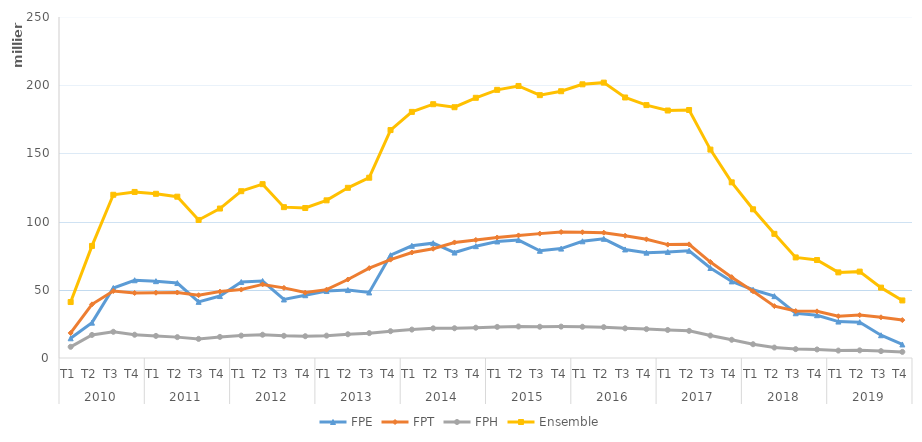
| Category | FPE | FPT | FPH | Ensemble |
|---|---|---|---|---|
| 0 | 14461 | 18375 | 8194 | 41030 |
| 1 | 25920 | 39331 | 16913 | 82164 |
| 2 | 51330 | 49127 | 19215 | 119672 |
| 3 | 56997 | 47685 | 17058 | 121740 |
| 4 | 56333 | 47855 | 16199 | 120387 |
| 5 | 54941 | 48017 | 15304 | 118262 |
| 6 | 41169 | 46030 | 14012 | 101211 |
| 7 | 45419 | 48677 | 15477 | 109573 |
| 8 | 55694 | 50172 | 16422 | 122288 |
| 9 | 56439 | 53952 | 17062 | 127453 |
| 10 | 42911 | 51408 | 16274 | 110593 |
| 11 | 46016 | 47957 | 15977 | 109950 |
| 12 | 49098 | 50100 | 16390 | 115588 |
| 13 | 49798 | 57543 | 17423 | 124764 |
| 14 | 48046 | 65901 | 18228 | 132175 |
| 15 | 75352 | 72092 | 19655 | 167099 |
| 16 | 82269 | 77335 | 20830 | 180434 |
| 17 | 84197 | 80120 | 21744 | 186061 |
| 18 | 77322 | 84712 | 21821 | 183855 |
| 19 | 81992 | 86552 | 22218 | 190762 |
| 20 | 85438 | 88354 | 22793 | 196585 |
| 21 | 86468 | 89868 | 23104 | 199440 |
| 22 | 78611 | 91183 | 22915 | 192709 |
| 23 | 80203 | 92369 | 23008 | 195580 |
| 24 | 85564 | 92183 | 22899 | 200646 |
| 25 | 87386 | 91885 | 22610 | 201881 |
| 26 | 79587 | 89645 | 21763 | 190995 |
| 27 | 77240 | 86998 | 21175 | 185413 |
| 28 | 77764 | 83129 | 20553 | 181446 |
| 29 | 78598 | 83323 | 19893 | 181814 |
| 30 | 65993 | 70352 | 16445 | 152790 |
| 31 | 56157 | 59278 | 13353 | 128788 |
| 32 | 50033 | 48898 | 10097 | 109028 |
| 33 | 45353 | 38029 | 7645 | 91027 |
| 34 | 32801 | 34418 | 6512 | 73731 |
| 35 | 31375 | 34198 | 6250 | 71823 |
| 36 | 26708 | 30613 | 5443 | 62764 |
| 37 | 26273 | 31448 | 5601 | 63323 |
| 38 | 16685 | 29856 | 5047 | 51588 |
| 39 | 9924 | 27791 | 4481 | 42196 |